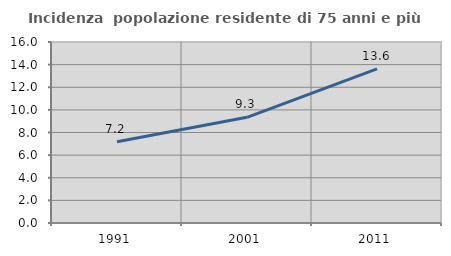
| Category | Incidenza  popolazione residente di 75 anni e più |
|---|---|
| 1991.0 | 7.181 |
| 2001.0 | 9.343 |
| 2011.0 | 13.623 |